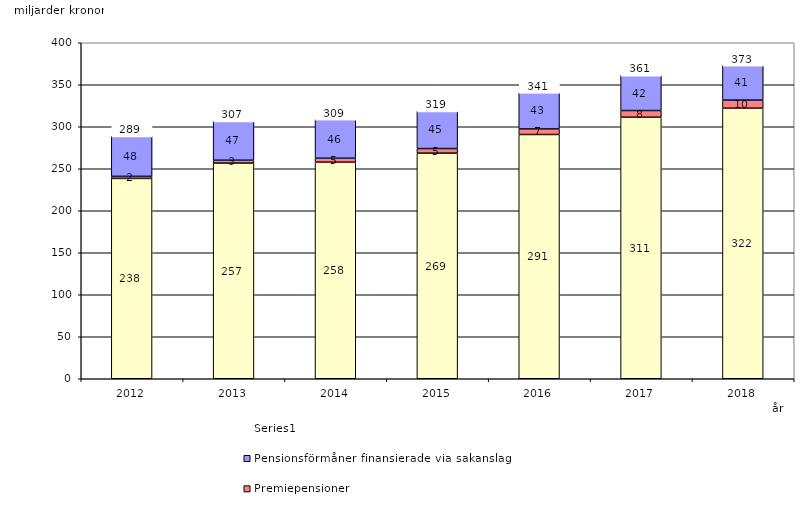
| Category | Inkomstpension och tilläggspension m.m. | Premiepensioner | Pensionsförmåner finansierade via sakanslag | Series 0 |
|---|---|---|---|---|
| 2012.0 | 238.478 | 2.465 | 48.024 | 20 |
| 2013.0 | 256.751 | 3.406 | 46.818 | 20 |
| 2014.0 | 257.86 | 4.68 | 46.255 | 20 |
| 2015.0 | 268.618 | 5.433 | 44.815 | 20 |
| 2016.0 | 290.786 | 6.607 | 43.331 | 20 |
| 2017.0 | 311.35 | 7.968 | 42.002 | 20 |
| 2018.0 | 322.119 | 9.615 | 41.439 | 20 |